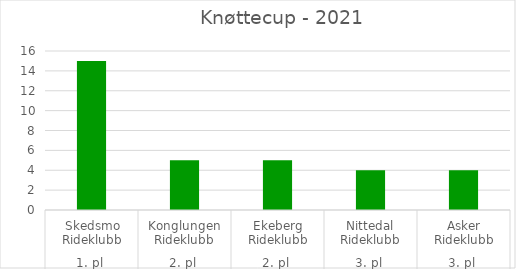
| Category | Series 1 |
|---|---|
| 0 | 15 |
| 1 | 5 |
| 2 | 5 |
| 3 | 4 |
| 4 | 4 |